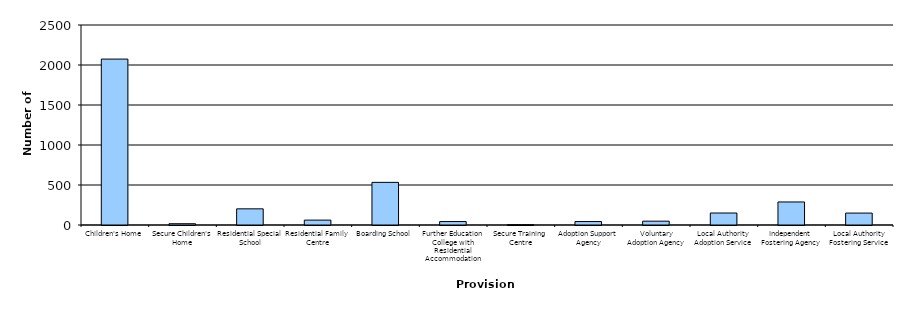
| Category | Series 0 |
|---|---|
| Children's Home | 2074 |
| Secure Children's Home | 16 |
| Residential Special School | 202 |
| Residential Family Centre | 61 |
| Boarding School | 533 |
| Further Education College with Residential Accommodation | 43 |
| Secure Training Centre | 4 |
| Adoption Support Agency | 43 |
| Voluntary Adoption Agency | 48 |
| Local Authority Adoption Service | 150 |
| Independent Fostering Agency | 288 |
| Local Authority Fostering Service | 149 |